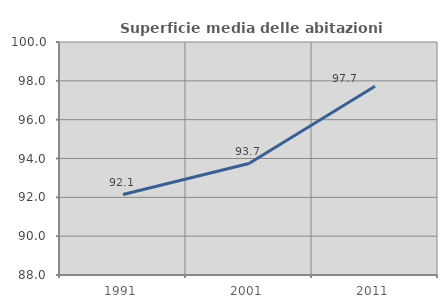
| Category | Superficie media delle abitazioni occupate |
|---|---|
| 1991.0 | 92.145 |
| 2001.0 | 93.739 |
| 2011.0 | 97.725 |